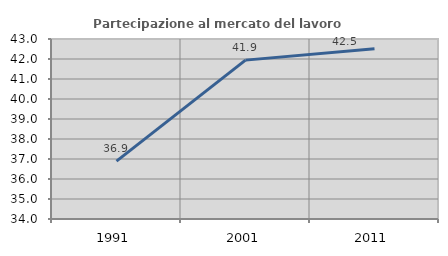
| Category | Partecipazione al mercato del lavoro  femminile |
|---|---|
| 1991.0 | 36.894 |
| 2001.0 | 41.944 |
| 2011.0 | 42.511 |